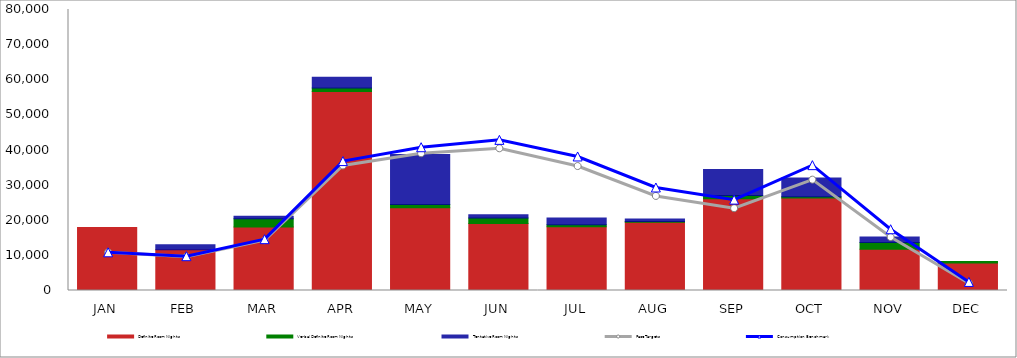
| Category | Definite Room Nights | Verbal Definite Room Nights | Tentative Room Nights |
|---|---|---|---|
| JAN | 17918 | 0 | 0 |
| FEB | 11630 | 0 | 1416 |
| MAR | 18085 | 2360 | 684 |
| APR | 56623 | 1046 | 3075 |
| MAY | 23573 | 920 | 14204 |
| JUN | 19053 | 1589 | 954 |
| JUL | 18154 | 585 | 1929 |
| AUG | 19422 | 216 | 720 |
| SEP | 26098 | 945 | 7379 |
| OCT | 26343 | 344 | 5315 |
| NOV | 11773 | 1872 | 1588 |
| DEC | 7818 | 440 | 0 |